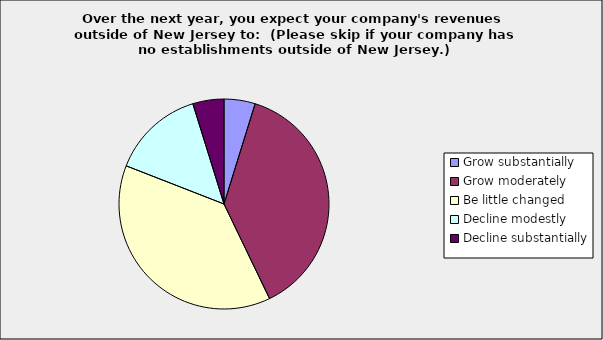
| Category | Series 0 |
|---|---|
| Grow substantially | 0.048 |
| Grow moderately | 0.381 |
| Be little changed | 0.381 |
| Decline modestly | 0.143 |
| Decline substantially | 0.048 |